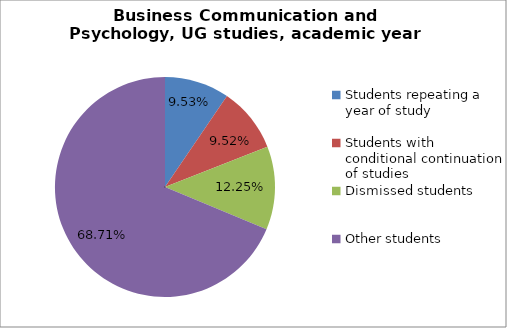
| Category | Series 0 |
|---|---|
| Students repeating a year of study | 14 |
| Students with conditional continuation of studies | 14 |
| Dismissed students | 18 |
| Other students | 101 |